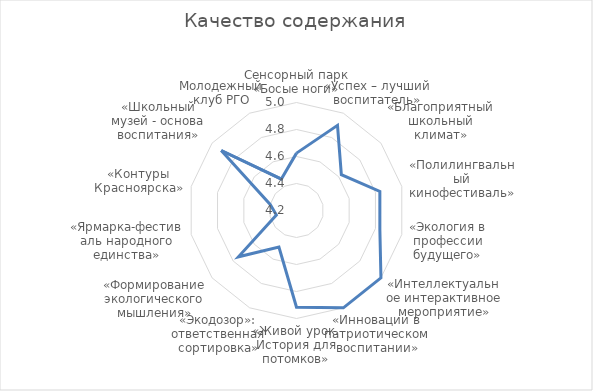
| Category | Series 0 |
|---|---|
| Сенсорный парк «Босые ноги» | 4.625 |
| «Успех – лучший воспитатель» | 4.9 |
| «Благоприятный школьный климат» | 4.625 |
| «Полилингвальный кинофестиваль» | 4.833 |
| «Экология в профессии будущего» | 4.833 |
| «Интеллектуальное интерактивное мероприятие» | 5 |
| «Инновации в патриотическом воспитании» | 5 |
| «Живой урок. История для потомков» | 4.917 |
| «Экодозор»: ответственная сортировка» | 4.5 |
| «Формирование экологического мышления» | 4.75 |
| «Ярмарка-фестиваль народного единства» | 4.353 |
| «Контуры Красноярска» | 4.4 |
| «Школьный музей - основа воспитания» | 4.913 |
| Молодежный клуб РГО | 4.458 |